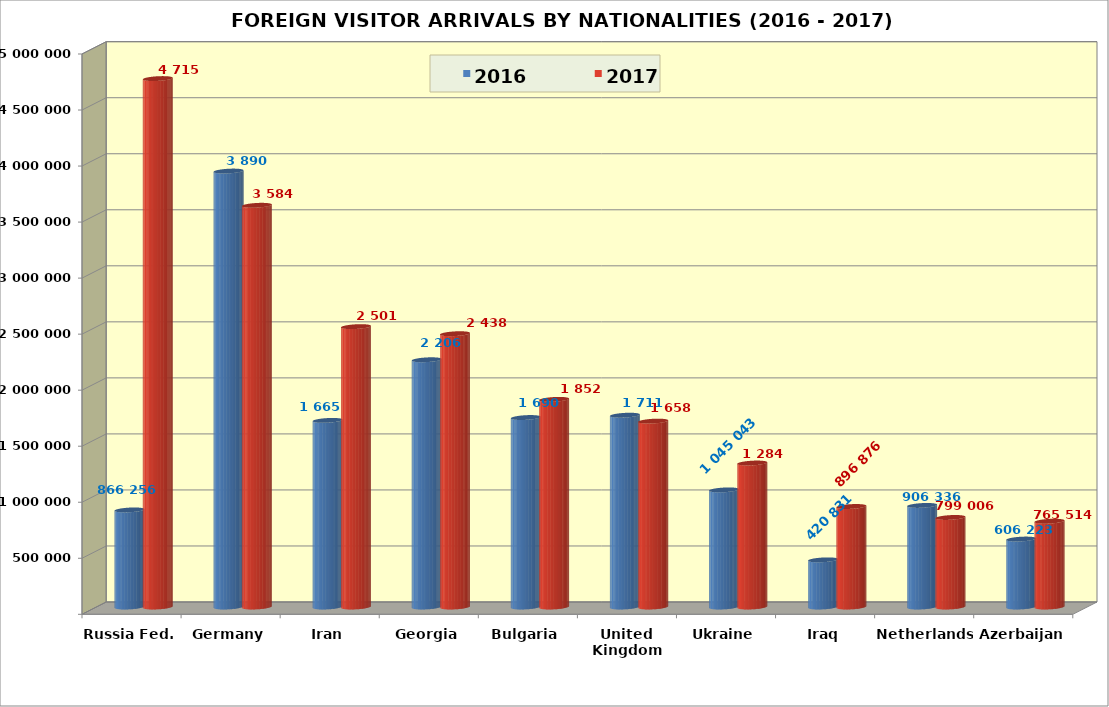
| Category | 2016 | 2017 |
|---|---|---|
| Russia Fed. | 866256 | 4715438 |
| Germany | 3890074 | 3584653 |
| Iran | 1665160 | 2501948 |
| Georgia | 2206266 | 2438730 |
| Bulgaria | 1690766 | 1852867 |
| United Kingdom (UK) | 1711481 | 1658715 |
| Ukraine | 1045043 | 1284735 |
| Iraq | 420831 | 896876 |
| Netherlands | 906336 | 799006 |
| Azerbaijan | 606223 | 765514 |